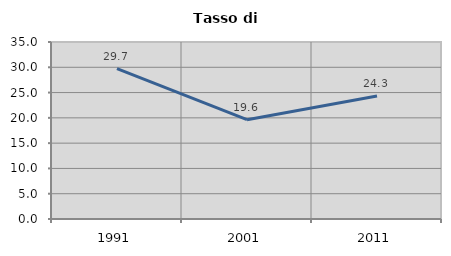
| Category | Tasso di disoccupazione   |
|---|---|
| 1991.0 | 29.744 |
| 2001.0 | 19.643 |
| 2011.0 | 24.324 |